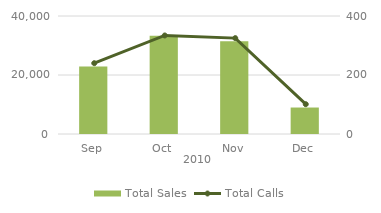
| Category | Total Sales |
|---|---|
| 0 | 22863 |
| 1 | 33338 |
| 2 | 31448 |
| 3 | 8974 |